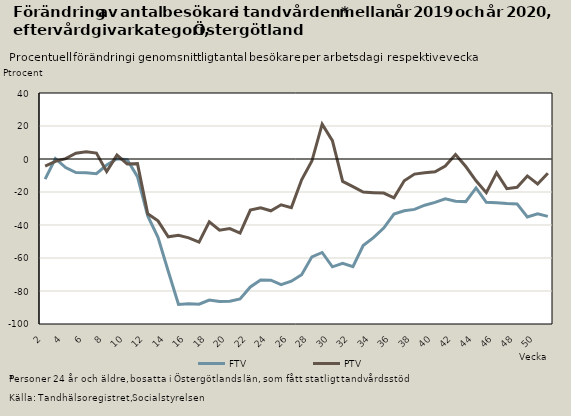
| Category | FTV | PTV |
|---|---|---|
| 2.0 | -12.237 | -4.275 |
| 3.0 | 0.243 | -1.399 |
| 4.0 | -5.21 | 0.191 |
| 5.0 | -8.255 | 3.473 |
| 6.0 | -8.309 | 4.323 |
| 7.0 | -8.905 | 3.611 |
| 8.0 | -3.668 | -7.655 |
| 9.0 | 0.139 | 2.349 |
| 10.0 | -0.426 | -3.006 |
| 11.0 | -10.691 | -2.815 |
| 12.0 | -34.559 | -33.217 |
| 13.0 | -47.527 | -37.488 |
| 14.0 | -68.066 | -47.182 |
| 15.0 | -88.168 | -46.274 |
| 16.0 | -87.73 | -47.829 |
| 17.0 | -88.018 | -50.424 |
| 18.0 | -85.476 | -38.106 |
| 19.0 | -86.385 | -43.192 |
| 20.0 | -86.165 | -42.198 |
| 21.0 | -84.834 | -44.863 |
| 22.0 | -77.524 | -30.938 |
| 23.0 | -73.294 | -29.636 |
| 24.0 | -73.469 | -31.375 |
| 25.0 | -76.091 | -27.727 |
| 26.0 | -74.052 | -29.462 |
| 27.0 | -70.095 | -12.58 |
| 28.0 | -59.307 | -1.242 |
| 29.0 | -56.663 | 21.088 |
| 30.0 | -65.333 | 11.111 |
| 31.0 | -63.255 | -13.58 |
| 32.0 | -65.26 | -16.711 |
| 33.0 | -52.474 | -20.033 |
| 34.0 | -47.656 | -20.401 |
| 35.0 | -41.831 | -20.643 |
| 36.0 | -33.333 | -23.562 |
| 37.0 | -31.35 | -13.164 |
| 38.0 | -30.538 | -9.151 |
| 39.0 | -28.011 | -8.282 |
| 40.0 | -26.299 | -7.696 |
| 41.0 | -24.143 | -4.28 |
| 42.0 | -25.555 | 2.751 |
| 43.0 | -25.822 | -4.569 |
| 44.0 | -17.527 | -13.242 |
| 45.0 | -26.228 | -20.411 |
| 46.0 | -26.485 | -8.317 |
| 47.0 | -26.938 | -17.985 |
| 48.0 | -27.235 | -17.128 |
| 49.0 | -35.093 | -10.264 |
| 50.0 | -33.202 | -15.171 |
| 51.0 | -34.756 | -8.66 |